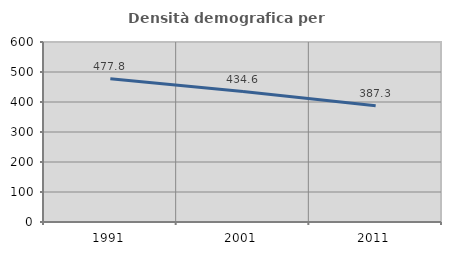
| Category | Densità demografica |
|---|---|
| 1991.0 | 477.78 |
| 2001.0 | 434.615 |
| 2011.0 | 387.277 |